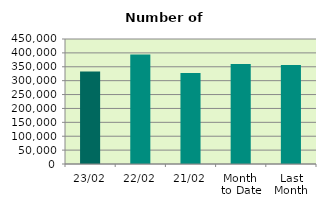
| Category | Series 0 |
|---|---|
| 23/02 | 332780 |
| 22/02 | 394320 |
| 21/02 | 327346 |
| Month 
to Date | 360402 |
| Last
Month | 356827.619 |